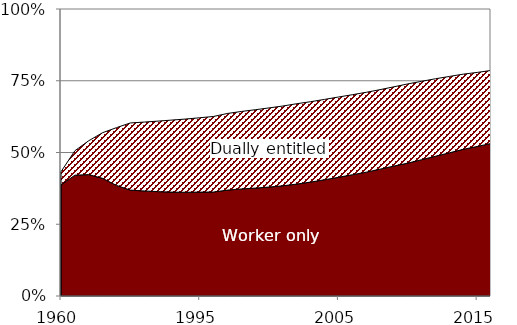
| Category | Worker only | Dually entitled | Dependents only |
|---|---|---|---|
| 1960.0 | 0.387 | 0.046 | 0.567 |
| 1970.0 | 0.421 | 0.085 | 0.494 |
| 1975.0 | 0.423 | 0.118 | 0.459 |
| 1980.0 | 0.41 | 0.159 | 0.431 |
| 1985.0 | 0.385 | 0.201 | 0.413 |
| 1990.0 | 0.369 | 0.234 | 0.397 |
| 1991.0 | 0.366 | 0.24 | 0.394 |
| 1992.0 | 0.364 | 0.246 | 0.391 |
| 1993.0 | 0.362 | 0.251 | 0.387 |
| 1994.0 | 0.361 | 0.255 | 0.383 |
| 1995.0 | 0.362 | 0.259 | 0.379 |
| 1996.0 | 0.362 | 0.263 | 0.374 |
| 1997.0 | 0.369 | 0.267 | 0.364 |
| 1998.0 | 0.373 | 0.27 | 0.357 |
| 1999.0 | 0.376 | 0.273 | 0.351 |
| 2000.0 | 0.38 | 0.276 | 0.345 |
| 2001.0 | 0.384 | 0.278 | 0.338 |
| 2002.0 | 0.39 | 0.28 | 0.33 |
| 2003.0 | 0.397 | 0.28 | 0.323 |
| 2004.0 | 0.405 | 0.28 | 0.315 |
| 2005.0 | 0.414 | 0.28 | 0.307 |
| 2006.0 | 0.423 | 0.279 | 0.299 |
| 2007.0 | 0.431 | 0.278 | 0.29 |
| 2008.0 | 0.442 | 0.277 | 0.281 |
| 2009.0 | 0.451 | 0.275 | 0.27 |
| 2010.0 | 0.463 | 0.276 | 0.261 |
| 2011.0 | 0.475 | 0.273 | 0.252 |
| 2012.0 | 0.487 | 0.27 | 0.243 |
| 2013.0 | 0.499 | 0.266 | 0.235 |
| 2014.0 | 0.511 | 0.262 | 0.227 |
| 2015.0 | 0.521 | 0.258 | 0.221 |
| 2016.0 | 0.531 | 0.254 | 0.214 |